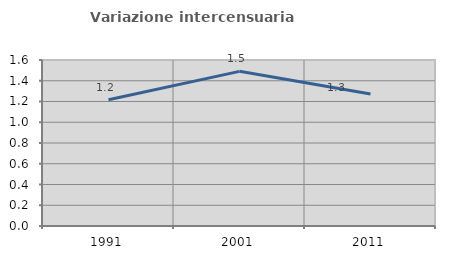
| Category | Variazione intercensuaria annua |
|---|---|
| 1991.0 | 1.216 |
| 2001.0 | 1.491 |
| 2011.0 | 1.272 |